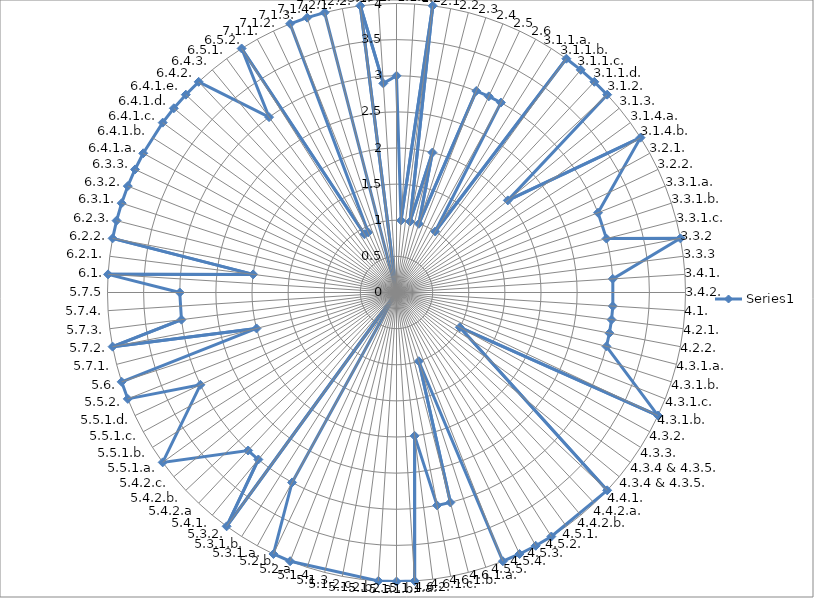
| Category | Series 0 |
|---|---|
| 1.1.1 | 3 |
| 1.1.2 | 1 |
| 1.2 | 4 |
| 2.1 | 1 |
| 2.2 | 2 |
| 2.3 | 1 |
| 2.4 | 3 |
| 2.5 | 3 |
| 2.6 | 3 |
| 3.1.1.a. | 1 |
| 3.1.1.b. | 4 |
| 3.1.1.c. | 4 |
| 3.1.1.d. | 4 |
| 3.1.2. | 4 |
| 3.1.3. | 2 |
| 3.1.4.a. | 0 |
| 3.1.4.b. | 4 |
| 3.2.1. | 0 |
| 3.2.2. | 0 |
| 3.3.1.a. | 3 |
| 3.3.1.b. | 0 |
| 3.3.1.c. | 3 |
| 3.3.2 | 4 |
| 3.3.3 | 0 |
| 3.4.1. | 3 |
| 3.4.2. | 0 |
| 4.1. | 3 |
| 4.2.1. | 3 |
| 4.2.2. | 3 |
| 4.3.1.a. | 3 |
| 4.3.1.b. | 0 |
| 4.3.1.c. | 0 |
| 4.3.1.b. | 4 |
| 4.3.2. | 1 |
| 4.3.3. | 0 |
| 4.3.4 & 4.3.5. | 0 |
| 4.3.4 & 4.3.5. | 0 |
| 4.4.1. | 4 |
| 4.4.2.a. | 0 |
| 4.4.2.b. | 0 |
| 4.5.1. | 0 |
| 4.5.2. | 4 |
| 4.5.3. | 4 |
| 4.5.4. | 4 |
| 4.5.5. | 4 |
| 4.6.1.a. | 1 |
| 4.6.1.b. | 3 |
| 4.6.1.c. | 3 |
| 4.6.2. | 2 |
| 5.1.1.a. | 4 |
| 5.1.1.b. | 4 |
| 5.1.2.a. | 4 |
| 5.1.2.b. | 0 |
| 5.1.2.c. | 0 |
| 5.1.3. | 0 |
| 5.1.4. | 0 |
| 5.2.a. | 4 |
| 5.2.b. | 4 |
| 5.3.1.a. | 3 |
| 5.3.1.b. | 0 |
| 5.3.2. | 4 |
| 5.4.1. | 3 |
| 5.4.2.a | 3 |
| 5.4.2.b. | 0 |
| 5.4.2.c. | 0 |
| 5.5.1.a. | 4 |
| 5.5.1.b. | 0 |
| 5.5.1.c. | 0 |
| 5.5.1.d. | 3 |
| 5.5.2. | 4 |
| 5.6. | 4 |
| 5.7.1. | 2 |
| 5.7.2. | 4 |
| 5.7.3. | 3 |
| 5.7.4. | 0 |
| 5.7.5 | 3 |
| 6.1. | 4 |
| 6.2.1. | 2 |
| 6.2.2. | 4 |
| 6.2.3. | 4 |
| 6.3.1. | 4 |
| 6.3.2. | 4 |
| 6.3.3. | 4 |
| 6.4.1.a. | 4 |
| 6.4.1.b. | 0 |
| 6.4.1.c. | 4 |
| 6.4.1.d. | 4 |
| 6.4.1.e. | 4 |
| 6.4.2. | 4 |
| 6.4.3. | 0 |
| 6.5.1. | 3 |
| 6.5.2. | 4 |
| 7.1.1. | 0.92 |
| 7.1.2. | 0.92 |
| 7.1.3. | 4 |
| 7.1.4. | 4 |
| 7.2.1. | 4 |
| 7.2.2. | 0 |
| 7.3.1. | 4 |
| 7.3.2. | 2.9 |